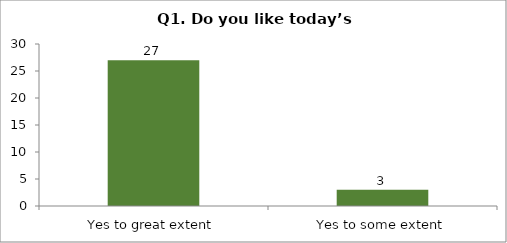
| Category | Q1. Do you like today’s session? |
|---|---|
| Yes to great extent | 27 |
| Yes to some extent | 3 |